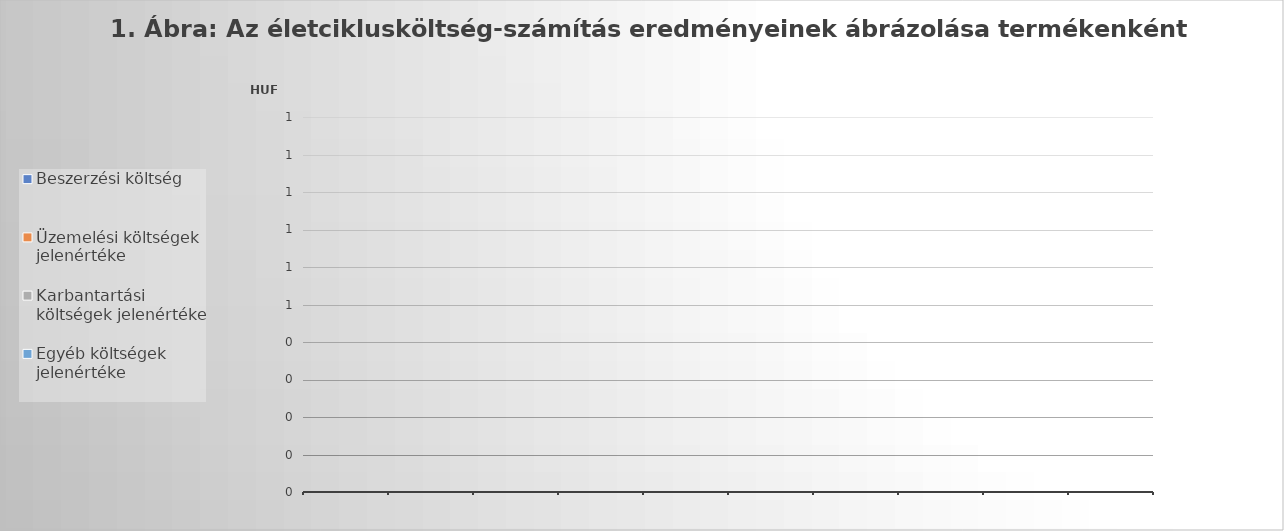
| Category | Egyéb költségek jelenértéke | Karbantartási költségek jelenértéke | Üzemelési költségek jelenértéke | Beszerzési költség |
|---|---|---|---|---|
| 0 | 0 | 0 | 0 | 0 |
| 1 | 0 | 0 | 0 | 0 |
| 2 | 0 | 0 | 0 | 0 |
| 3 | 0 | 0 | 0 | 0 |
| 4 | 0 | 0 | 0 | 0 |
| 5 | 0 | 0 | 0 | 0 |
| 6 | 0 | 0 | 0 | 0 |
| 7 | 0 | 0 | 0 | 0 |
| 8 | 0 | 0 | 0 | 0 |
| 9 | 0 | 0 | 0 | 0 |